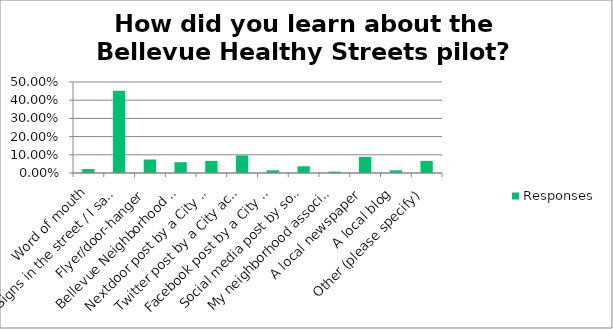
| Category | Responses |
|---|---|
| Word of mouth | 0.022 |
| Signs in the street / I saw the street was closed | 0.452 |
| Flyer/door-hanger | 0.074 |
| Bellevue Neighborhood News | 0.059 |
| Nextdoor post by a City account | 0.067 |
| Twitter post by a City account | 0.096 |
| Facebook post by a City account | 0.015 |
| Social media post by someone else (friend, family, neighbor, etc.) | 0.037 |
| My neighborhood association | 0.007 |
| A local newspaper | 0.089 |
| A local blog | 0.015 |
| Other (please specify) | 0.067 |